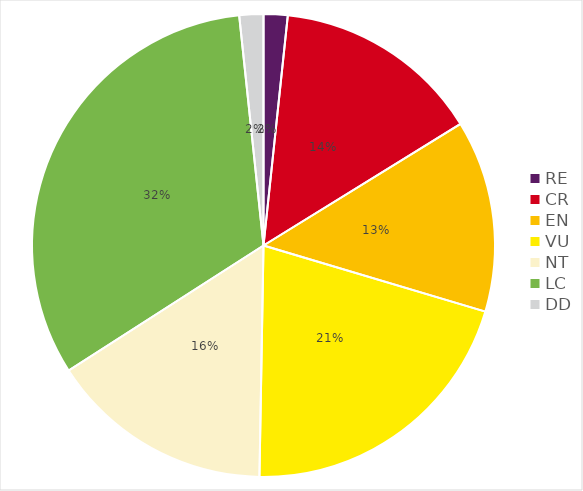
| Category | RE |
|---|---|
| RE | 0.017 |
| CR | 0.145 |
| EN | 0.134 |
| VU | 0.207 |
| NT | 0.156 |
| LC | 0.324 |
| DD | 0.017 |